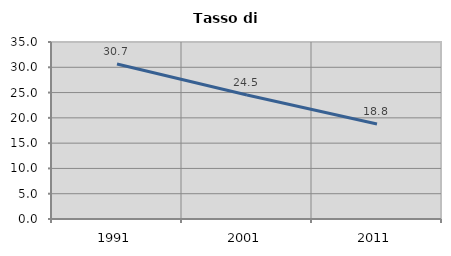
| Category | Tasso di disoccupazione   |
|---|---|
| 1991.0 | 30.651 |
| 2001.0 | 24.517 |
| 2011.0 | 18.775 |